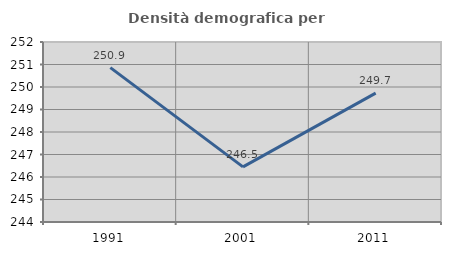
| Category | Densità demografica |
|---|---|
| 1991.0 | 250.86 |
| 2001.0 | 246.45 |
| 2011.0 | 249.726 |